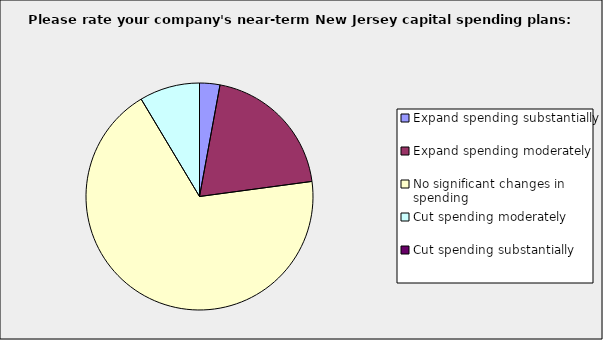
| Category | Series 0 |
|---|---|
| Expand spending substantially | 0.029 |
| Expand spending moderately | 0.2 |
| No significant changes in spending | 0.686 |
| Cut spending moderately | 0.086 |
| Cut spending substantially | 0 |